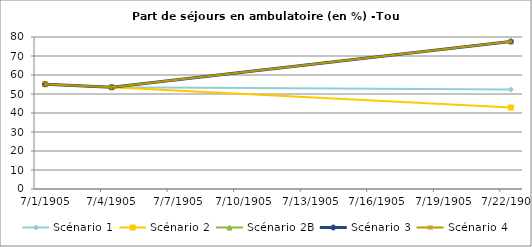
| Category | Scénario 1 | Scénario 2 | Scénario 2B | Scénario 3 | Scénario 4 |
|---|---|---|---|---|---|
| 2009.0 | 55.186 | 55.186 | 55.186 | 55.186 | 55.186 |
| 2012.0 | 53.58 | 53.58 | 53.58 | 53.58 | 53.58 |
| 2030.0 | 52.321 | 42.907 | 77.659 | 77.659 | 77.659 |